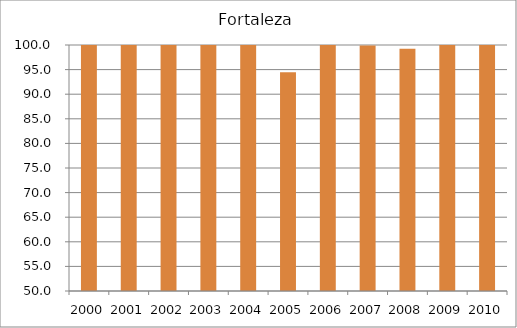
| Category | Fortaleza |
|---|---|
| 2000.0 | 124.22 |
| 2001.0 | 114.41 |
| 2002.0 | 104.23 |
| 2003.0 | 118.06 |
| 2004.0 | 101.77 |
| 2005.0 | 94.47 |
| 2006.0 | 110.08 |
| 2007.0 | 99.92 |
| 2008.0 | 99.24 |
| 2009.0 | 103.02 |
| 2010.0 | 105.05 |